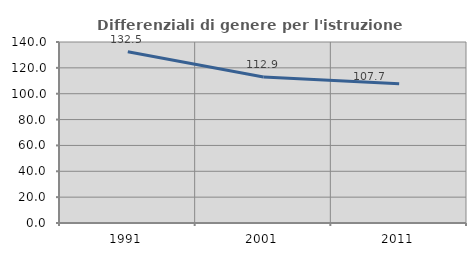
| Category | Differenziali di genere per l'istruzione superiore |
|---|---|
| 1991.0 | 132.498 |
| 2001.0 | 112.859 |
| 2011.0 | 107.653 |